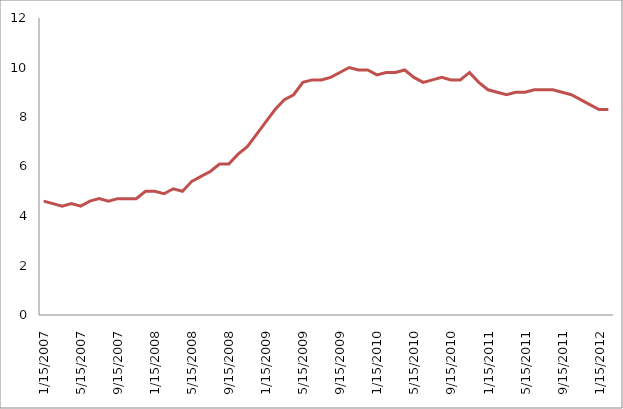
| Category | Series 0 |
|---|---|
| 2007-01-15 | 4.6 |
| 2007-02-15 | 4.5 |
| 2007-03-15 | 4.4 |
| 2007-04-15 | 4.5 |
| 2007-05-15 | 4.4 |
| 2007-06-15 | 4.6 |
| 2007-07-15 | 4.7 |
| 2007-08-15 | 4.6 |
| 2007-09-15 | 4.7 |
| 2007-10-15 | 4.7 |
| 2007-11-15 | 4.7 |
| 2007-12-15 | 5 |
| 2008-01-15 | 5 |
| 2008-02-15 | 4.9 |
| 2008-03-15 | 5.1 |
| 2008-04-15 | 5 |
| 2008-05-15 | 5.4 |
| 2008-06-15 | 5.6 |
| 2008-07-15 | 5.8 |
| 2008-08-15 | 6.1 |
| 2008-09-15 | 6.1 |
| 2008-10-15 | 6.5 |
| 2008-11-15 | 6.8 |
| 2008-12-15 | 7.3 |
| 2009-01-15 | 7.8 |
| 2009-02-15 | 8.3 |
| 2009-03-15 | 8.7 |
| 2009-04-15 | 8.9 |
| 2009-05-15 | 9.4 |
| 2009-06-15 | 9.5 |
| 2009-07-15 | 9.5 |
| 2009-08-15 | 9.6 |
| 2009-09-15 | 9.8 |
| 2009-10-15 | 10 |
| 2009-11-15 | 9.9 |
| 2009-12-15 | 9.9 |
| 2010-01-15 | 9.7 |
| 2010-02-15 | 9.8 |
| 2010-03-15 | 9.8 |
| 2010-04-15 | 9.9 |
| 2010-05-15 | 9.6 |
| 2010-06-15 | 9.4 |
| 2010-07-15 | 9.5 |
| 2010-08-15 | 9.6 |
| 2010-09-15 | 9.5 |
| 2010-10-15 | 9.5 |
| 2010-11-15 | 9.8 |
| 2010-12-15 | 9.4 |
| 2011-01-15 | 9.1 |
| 2011-02-15 | 9 |
| 2011-03-15 | 8.9 |
| 2011-04-15 | 9 |
| 2011-05-15 | 9 |
| 2011-06-15 | 9.1 |
| 2011-07-15 | 9.1 |
| 2011-08-15 | 9.1 |
| 2011-09-15 | 9 |
| 2011-10-15 | 8.9 |
| 2011-11-15 | 8.7 |
| 2011-12-15 | 8.5 |
| 2012-01-15 | 8.3 |
| 2012-02-15 | 8.3 |